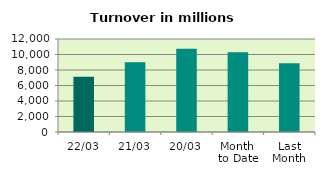
| Category | Series 0 |
|---|---|
| 22/03 | 7116.953 |
| 21/03 | 8996.242 |
| 20/03 | 10749.062 |
| Month 
to Date | 10299.15 |
| Last
Month | 8884.685 |